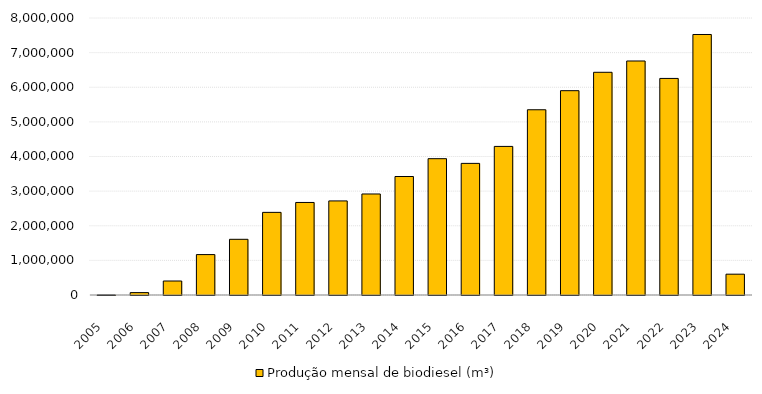
| Category | Produção mensal de biodiesel (m³) |
|---|---|
| 2005.0 | 736.16 |
| 2006.0 | 69001.981 |
| 2007.0 | 404329.14 |
| 2008.0 | 1167128.415 |
| 2009.0 | 1608448.417 |
| 2010.0 | 2386398.518 |
| 2011.0 | 2672759.918 |
| 2012.0 | 2717483.489 |
| 2013.0 | 2917488.269 |
| 2014.0 | 3422209.897 |
| 2015.0 | 3937268.534 |
| 2016.0 | 3801338.998 |
| 2017.0 | 4291293.772 |
| 2018.0 | 5350036.398 |
| 2019.0 | 5901104.354 |
| 2020.0 | 6432036.594 |
| 2021.0 | 6758382.372 |
| 2022.0 | 6254710.27 |
| 2023.0 | 7523835.98 |
| 2024.0 | 601391.614 |